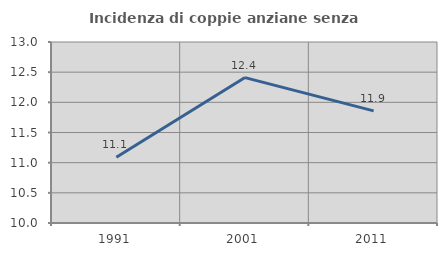
| Category | Incidenza di coppie anziane senza figli  |
|---|---|
| 1991.0 | 11.089 |
| 2001.0 | 12.41 |
| 2011.0 | 11.858 |